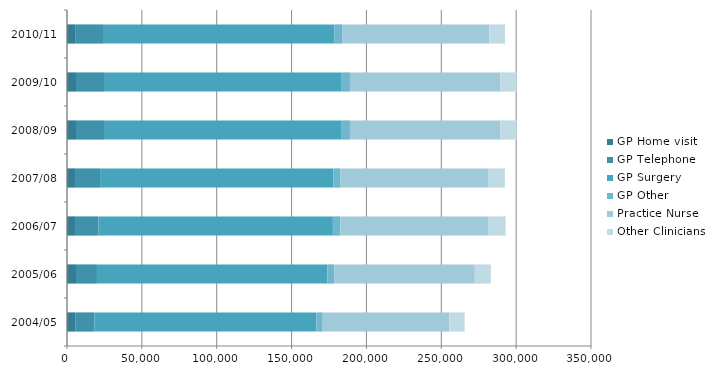
| Category | GP Home visit | GP Telephone | GP Surgery | GP Other | Practice Nurse  | Other Clinicians |
|---|---|---|---|---|---|---|
| 2004/05 | 5800 | 12500 | 148300 | 4200 | 84600 | 10200 |
| 2005/06 | 6000 | 14000 | 153900 | 4800 | 93700 | 10700 |
| 2006/07 | 5900 | 15100 | 156600 | 5000 | 99000 | 11400 |
| 2007/08 | 5900 | 16200 | 155800 | 4800 | 98500 | 11300 |
| 2008/09 | 6000 | 18700 | 158800 | 5500 | 100600 | 10800 |
| 2009/10 | 6000 | 18700 | 158800 | 5500 | 100600 | 10800 |
| 2010/11 | 5843.555 | 18212.412 | 154659.413 | 5356.592 | 97976.933 | 10518.398 |